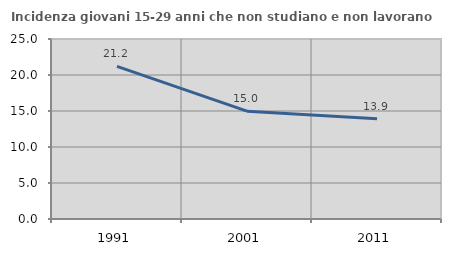
| Category | Incidenza giovani 15-29 anni che non studiano e non lavorano  |
|---|---|
| 1991.0 | 21.205 |
| 2001.0 | 14.973 |
| 2011.0 | 13.939 |